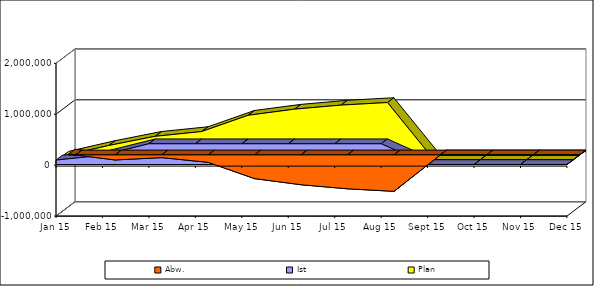
| Category | Abw. | Ist | Plan |
|---|---|---|---|
| 2015-01-01 | 17354 | 87354 | 70000 |
| 2015-02-01 | -99179 | 180821 | 280000 |
| 2015-03-01 | -52005 | 407995 | 460000 |
| 2015-04-01 | -145005 | 407995 | 553000 |
| 2015-05-01 | -465005 | 407995 | 873000 |
| 2015-06-01 | -585005 | 407995 | 993000 |
| 2015-07-01 | -665005 | 407995 | 1073000 |
| 2015-08-01 | -715005 | 407995 | 1123000 |
| 2015-09-01 | 0 | 0 | 0 |
| 2015-10-01 | 0 | 0 | 0 |
| 2015-11-01 | 0 | 0 | 0 |
| 2015-12-01 | 0 | 0 | 0 |